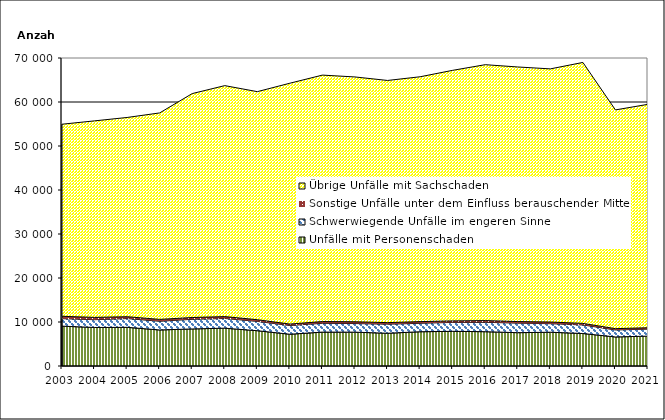
| Category | Unfälle mit Personenschaden | Schwerwiegende Unfälle im engeren Sinne | Sonstige Unfälle unter dem Einfluss berauschender Mittel 1) | Übrige Unfälle mit Sachschaden |
|---|---|---|---|---|
| 2003.0 | 9058 | 1702 | 542 | 43646 |
| 2004.0 | 8755 | 1770 | 513 | 44673 |
| 2005.0 | 8788 | 1991 | 422 | 45281 |
| 2006.0 | 8190 | 1977 | 424 | 46926 |
| 2007.0 | 8426 | 2186 | 404 | 50897 |
| 2008.0 | 8594 | 2206 | 432 | 52488 |
| 2009.0 | 8022 | 2115 | 380 | 51835 |
| 2010.0 | 7217 | 1987 | 324 | 54741 |
| 2011.0 | 7704 | 2003 | 394 | 56014 |
| 2012.0 | 7691 | 1958 | 401 | 55640 |
| 2013.0 | 7443 | 2059 | 355 | 55040 |
| 2014.0 | 7787 | 1921 | 380 | 55646 |
| 2015.0 | 7881 | 2030 | 341 | 56944 |
| 2016.0 | 7795 | 2138 | 392 | 58152 |
| 2017.0 | 7572 | 2169 | 356 | 57863 |
| 2018.0 | 7677 | 1941 | 377 | 57533 |
| 2019.0 | 7386 | 1946 | 351 | 59308 |
| 2020.0 | 6600 | 1591 | 293 | 49717 |
| 2021.0 | 6791 | 1595 | 305 | 50783 |